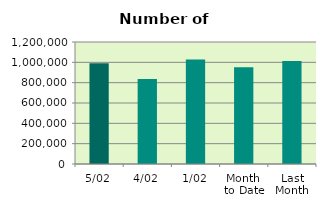
| Category | Series 0 |
|---|---|
| 5/02 | 991602 |
| 4/02 | 835962 |
| 1/02 | 1027526 |
| Month 
to Date | 951696.667 |
| Last
Month | 1012702.182 |